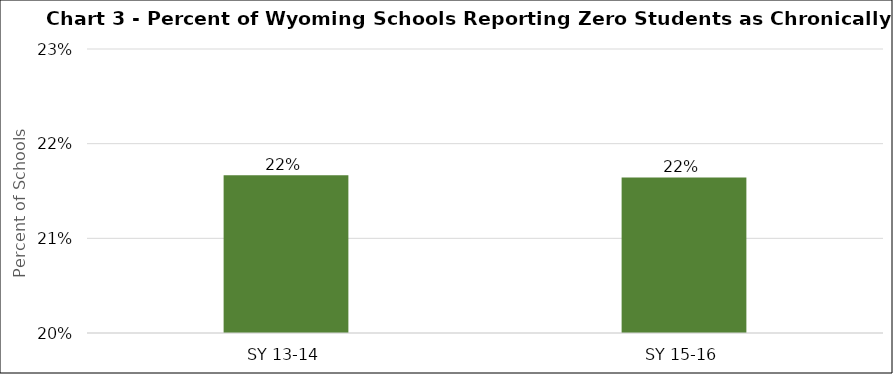
| Category | Series 0 |
|---|---|
| SY 13-14 | 0.217 |
| SY 15-16 | 0.216 |